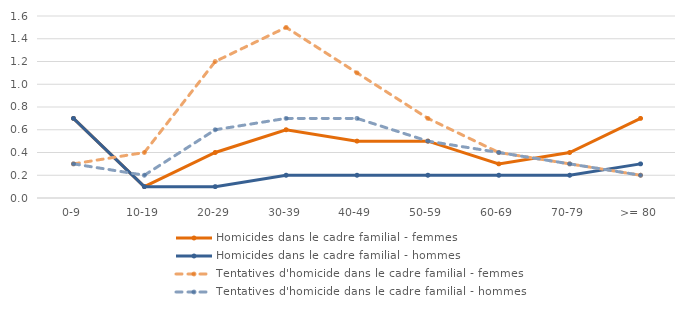
| Category | Homicides dans le cadre familial - femmes | Homicides dans le cadre familial - hommes | Tentatives d'homicide dans le cadre familial - femmes | Tentatives d'homicide dans le cadre familial - hommes |
|---|---|---|---|---|
| 0-9 | 0.7 | 0.7 | 0.3 | 0.3 |
| 10-19 | 0.1 | 0.1 | 0.4 | 0.2 |
| 20-29 | 0.4 | 0.1 | 1.2 | 0.6 |
| 30-39 | 0.6 | 0.2 | 1.5 | 0.7 |
| 40-49 | 0.5 | 0.2 | 1.1 | 0.7 |
| 50-59 | 0.5 | 0.2 | 0.7 | 0.5 |
| 60-69 | 0.3 | 0.2 | 0.4 | 0.4 |
| 70-79 | 0.4 | 0.2 | 0.3 | 0.3 |
| >= 80 | 0.7 | 0.3 | 0.2 | 0.2 |